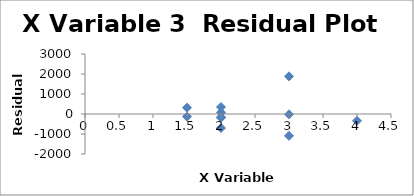
| Category | Series 0 |
|---|---|
| 2.0 | 349.35 |
| 2.0 | -160.299 |
| 1.5 | -130.233 |
| 2.0 | -700.219 |
| 3.0 | -17.042 |
| 2.0 | -186.234 |
| 1.5 | 316.18 |
| 2.0 | 78.407 |
| 3.0 | 1883.068 |
| 4.0 | -340.074 |
| 3.0 | -1092.905 |